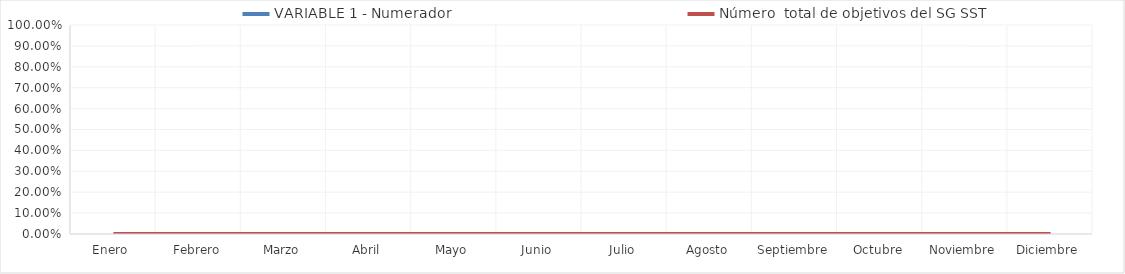
| Category | VARIABLE 1 - Numerador | Número  total de objetivos del SG SST |
|---|---|---|
| Enero  | 0 | 0 |
| Febrero | 0 | 0 |
| Marzo | 0 | 0 |
| Abril | 0 | 0 |
| Mayo | 0 | 0 |
| Junio | 0 | 0 |
| Julio | 0 | 0 |
| Agosto | 0 | 0 |
| Septiembre | 0 | 0 |
| Octubre | 0 | 0 |
| Noviembre | 0 | 0 |
| Diciembre | 0 | 0 |